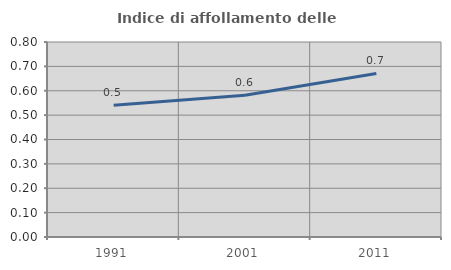
| Category | Indice di affollamento delle abitazioni  |
|---|---|
| 1991.0 | 0.541 |
| 2001.0 | 0.581 |
| 2011.0 | 0.671 |